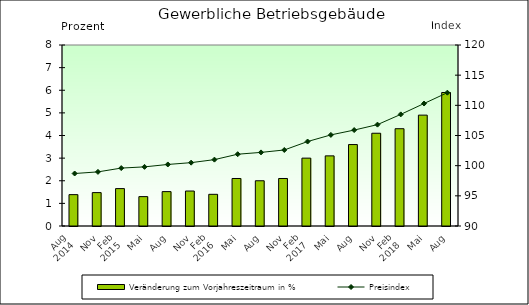
| Category | Veränderung zum Vorjahreszeitraum in % |
|---|---|
| 0 | 1.386 |
| 1 | 1.476 |
| 2 | 1.653 |
| 3 | 1.299 |
| 4 | 1.519 |
| 5 | 1.546 |
| 6 | 1.4 |
| 7 | 2.1 |
| 8 | 2 |
| 9 | 2.1 |
| 10 | 3 |
| 11 | 3.1 |
| 12 | 3.6 |
| 13 | 4.1 |
| 14 | 4.3 |
| 15 | 4.9 |
| 16 | 5.9 |